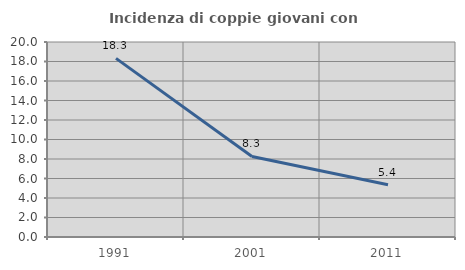
| Category | Incidenza di coppie giovani con figli |
|---|---|
| 1991.0 | 18.321 |
| 2001.0 | 8.264 |
| 2011.0 | 5.357 |